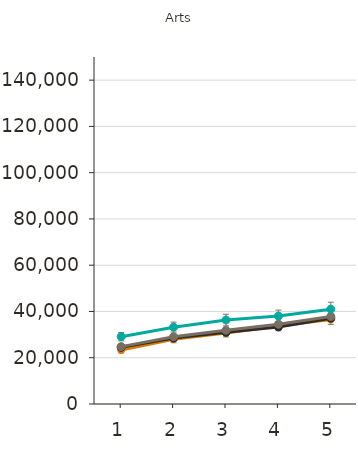
| Category | College-level Certificate | College-level Diploma | Bachelor's Degree | Master's Degree | Doctoral Degree | Professional Degree |
|---|---|---|---|---|---|---|
| 1.0 | 23300 | 24500 | 24800 | 29100 |  |  |
| 2.0 | 28000 | 28500 | 29100 | 33200 |  |  |
| 3.0 | 30700 | 31000 | 31900 | 36300 |  |  |
| 4.0 | 33700 | 33300 | 34500 | 38000 |  |  |
| 5.0 | 36500 | 37100 | 37800 | 41000 |  |  |